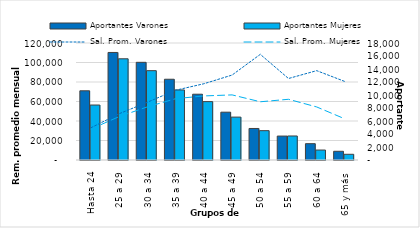
| Category | Aportantes Varones | Aportantes Mujeres |
|---|---|---|
| Hasta 24 | 10649 | 8457 |
| 25 a 29 | 16544 | 15571 |
| 30 a 34 | 15027 | 13743 |
| 35 a 39 | 12425 | 10777 |
| 40 a 44 | 10122 | 8982 |
| 45 a 49 | 7356 | 6599 |
| 50 a 54 | 4850 | 4513 |
| 55 a 59 | 3681 | 3695 |
| 60 a 64 | 2512 | 1532 |
| 65 y más | 1340 | 878 |